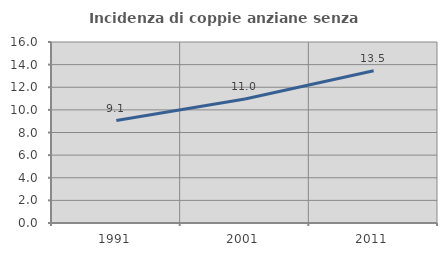
| Category | Incidenza di coppie anziane senza figli  |
|---|---|
| 1991.0 | 9.056 |
| 2001.0 | 10.966 |
| 2011.0 | 13.459 |